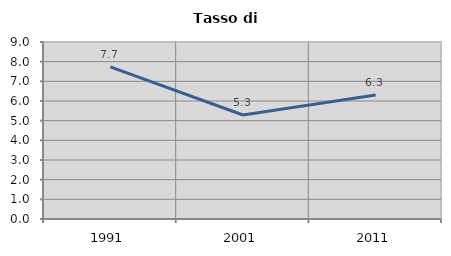
| Category | Tasso di disoccupazione   |
|---|---|
| 1991.0 | 7.733 |
| 2001.0 | 5.288 |
| 2011.0 | 6.302 |